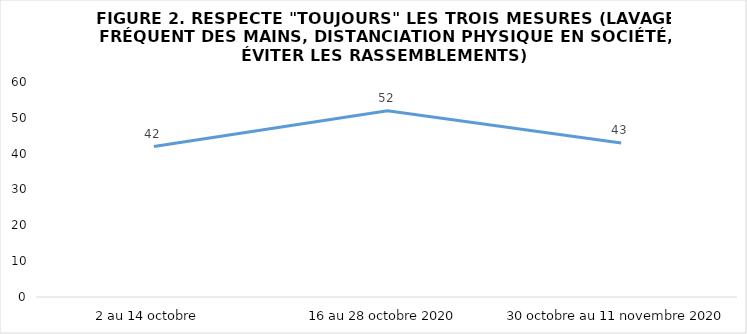
| Category | Series 0 |
|---|---|
| 2 au 14 octobre  | 42 |
| 16 au 28 octobre 2020 | 52 |
| 30 octobre au 11 novembre 2020 | 43 |